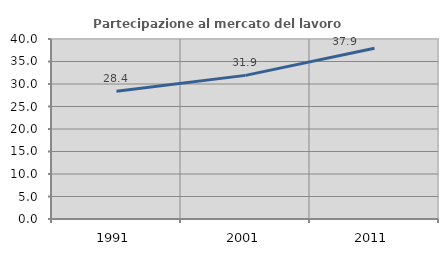
| Category | Partecipazione al mercato del lavoro  femminile |
|---|---|
| 1991.0 | 28.414 |
| 2001.0 | 31.917 |
| 2011.0 | 37.937 |